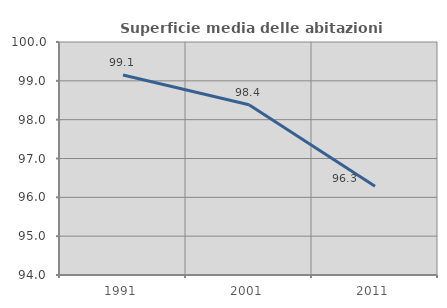
| Category | Superficie media delle abitazioni occupate |
|---|---|
| 1991.0 | 99.149 |
| 2001.0 | 98.385 |
| 2011.0 | 96.284 |